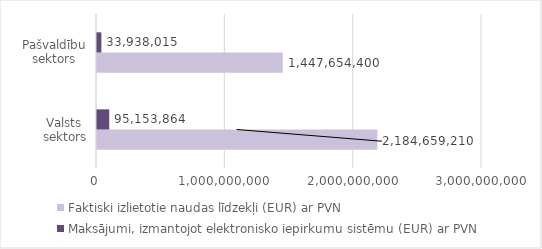
| Category | Faktiski izlietotie naudas līdzekļi (EUR) ar PVN | Maksājumi, izmantojot elektronisko iepirkumu sistēmu (EUR) ar PVN |
|---|---|---|
| Valsts sektors | 2184659210 | 95153864 |
| Pašvaldību sektors | 1447654400 | 33938015 |